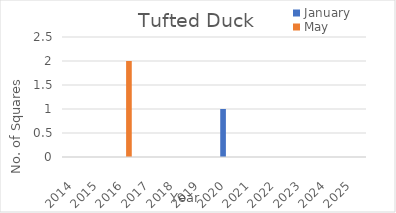
| Category | January | May |
|---|---|---|
| 2014.0 | 0 | 0 |
| 2015.0 | 0 | 0 |
| 2016.0 | 0 | 2 |
| 2017.0 | 0 | 0 |
| 2018.0 | 0 | 0 |
| 2019.0 | 0 | 0 |
| 2020.0 | 1 | 0 |
| 2021.0 | 0 | 0 |
| 2022.0 | 0 | 0 |
| 2023.0 | 0 | 0 |
| 2024.0 | 0 | 0 |
| 2025.0 | 0 | 0 |